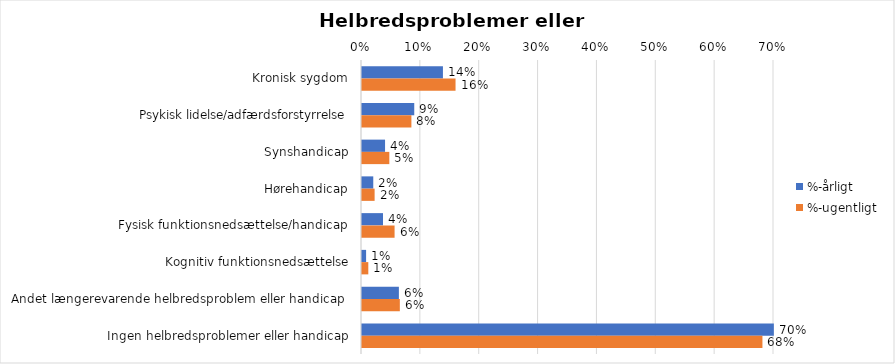
| Category | %-årligt | %-ugentligt |
|---|---|---|
| Kronisk sygdom | 0.138 | 0.159 |
| Psykisk lidelse/adfærdsforstyrrelse | 0.089 | 0.084 |
| Synshandicap | 0.039 | 0.046 |
| Hørehandicap | 0.019 | 0.021 |
| Fysisk funktionsnedsættelse/handicap | 0.036 | 0.055 |
| Kognitiv funktionsnedsættelse | 0.007 | 0.011 |
| Andet længerevarende helbredsproblem eller handicap  | 0.063 | 0.064 |
| Ingen helbredsproblemer eller handicap | 0.7 | 0.68 |